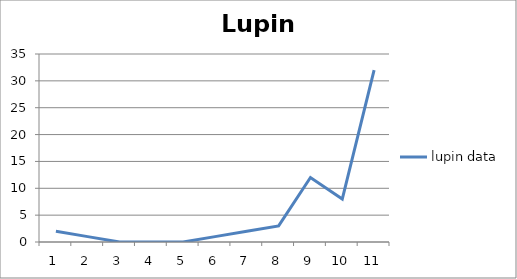
| Category | lupin data |
|---|---|
| 0 | 2 |
| 1 | 1 |
| 2 | 0 |
| 3 | 0 |
| 4 | 0 |
| 5 | 1 |
| 6 | 2 |
| 7 | 3 |
| 8 | 12 |
| 9 | 8 |
| 10 | 32 |